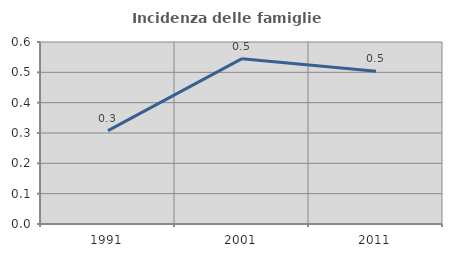
| Category | Incidenza delle famiglie numerose |
|---|---|
| 1991.0 | 0.308 |
| 2001.0 | 0.545 |
| 2011.0 | 0.504 |